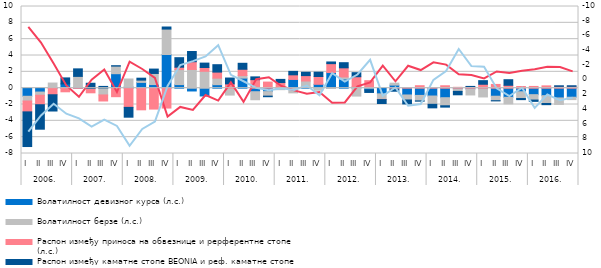
| Category | Волатилност девизног курса (л.с.) | Волатилност берзе (л.с.) | Распон између приноса на обвезнице и рерферентне стопе (л.с.) | Распон између каматне стопе BEONIA и реф. каматне стопе (л.с.) |
|---|---|---|---|---|
| 0 | -0.994 | -0.581 | -1.329 | -4.243 |
| 1 | -0.476 | -0.393 | -1.159 | -2.996 |
| 2 | 0.066 | 0.563 | -0.806 | -1.99 |
| 3 | 0.521 | -0.028 | -0.417 | 0.735 |
| 4 | 0.116 | 1.326 | -0.016 | 0.921 |
| 5 | -0.023 | -0.075 | -0.471 | 0.601 |
| 6 | 0.031 | -0.832 | -0.737 | 0.184 |
| 7 | 1.772 | 0.928 | -1.043 | 0.048 |
| 8 | 0.154 | 0.972 | -2.351 | -1.203 |
| 9 | 0.705 | 0.279 | -2.651 | 0.238 |
| 10 | 0.442 | 1.358 | -2.561 | 0.537 |
| 11 | 4.123 | 3.113 | -2.437 | 0.254 |
| 12 | 0.438 | 1.84 | 0.288 | 1.165 |
| 13 | -0.343 | 2.291 | 0.949 | 1.25 |
| 14 | -0.956 | 2.065 | 0.463 | 0.541 |
| 15 | 0.427 | 0.801 | 0.741 | 0.906 |
| 16 | -0.009 | -0.838 | 0.524 | 0.717 |
| 17 | 1.234 | 0.3 | 0.78 | 0.732 |
| 18 | -0.434 | -0.983 | 1.043 | 0.338 |
| 19 | -0.424 | -0.551 | 0.744 | -0.071 |
| 20 | 0.03 | -0.185 | 0.658 | 0.388 |
| 21 | 1.068 | -0.573 | 0.565 | 0.424 |
| 22 | 0.107 | 0.769 | 0.662 | 0.41 |
| 23 | 0.473 | -0.254 | 0.952 | 0.531 |
| 24 | 1.913 | -0.037 | 1.089 | 0.206 |
| 25 | 1.124 | 0.246 | 1.122 | 0.627 |
| 26 | 0.136 | -0.97 | 1.264 | 0.496 |
| 27 | -0.218 | 0.095 | 0.821 | -0.306 |
| 28 | -0.697 | -0.676 | -0.025 | -0.479 |
| 29 | 0.375 | 0.239 | -0.114 | -0.259 |
| 30 | -0.833 | -0.612 | 0.058 | -0.484 |
| 31 | -0.886 | -0.675 | 0.302 | -0.027 |
| 32 | -0.962 | -1.014 | 0.067 | -0.434 |
| 33 | -1.168 | -0.99 | 0.296 | -0.163 |
| 34 | -0.088 | -0.306 | 0.104 | -0.419 |
| 35 | -0.104 | -0.725 | 0.201 | 0.013 |
| 36 | -0.07 | -1.005 | 0.479 | 0.441 |
| 37 | -0.988 | -0.548 | 0.457 | -0.018 |
| 38 | -1.119 | -0.801 | 0.352 | 0.683 |
| 39 | -0.441 | -0.829 | 0.204 | -0.133 |
| 40 | -0.796 | -0.661 | 0.213 | -0.161 |
| 41 | -0.919 | -0.955 | 0.28 | -0.145 |
| 42 | -1.195 | -0.799 | 0.22 | 0.072 |
| 43 | -1.111 | -0.289 | 0.22 | 0.075 |